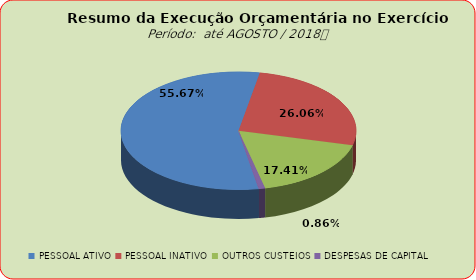
| Category | Series 0 |
|---|---|
| PESSOAL ATIVO | 100103372.98 |
| PESSOAL INATIVO | 46858557.7 |
| OUTROS CUSTEIOS | 31305768.44 |
| DESPESAS DE CAPITAL | 1541005.81 |